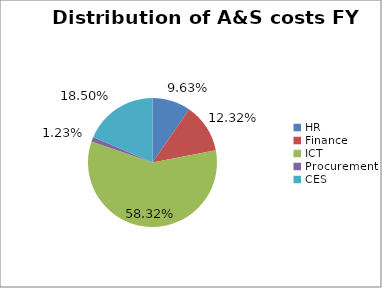
| Category | Distribution of A&S costs FY 2013/14 |
|---|---|
| HR | 0.096 |
| Finance | 0.123 |
| ICT | 0.583 |
| Procurement | 0.012 |
| CES | 0.185 |